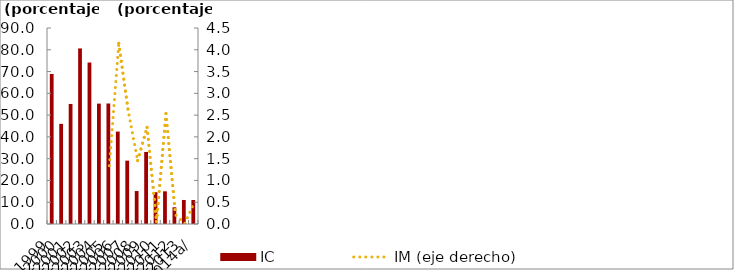
| Category | IC |
|---|---|
| 1999 | 68.933 |
| 2000 | 45.992 |
| 2001 | 55.123 |
| 2002 | 80.618 |
| 2003 | 74.186 |
| 2004 | 55.282 |
| 2005 | 55.332 |
| 2006 | 42.442 |
| 2007 | 29.09 |
| 2008 | 15.134 |
| 2009 | 33.087 |
| 2010 | 14.603 |
| 2011 | 15.004 |
| 2012 | 7.684 |
| 2013 | 11.037 |
| 2014a/ | 11.031 |